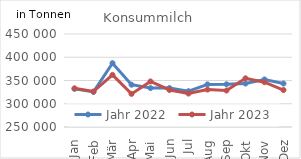
| Category | Jahr 2022 | Jahr 2023 |
|---|---|---|
| Jan | 332001.787 | 333199.953 |
| Feb | 325451.771 | 326309.981 |
| Mär | 387283.406 | 362072.387 |
| Apr | 340948.316 | 321197.593 |
| Mai | 333684.936 | 347976.701 |
| Jun | 333744.565 | 329624.153 |
| Jul | 326940.633 | 321912.043 |
| Aug | 341656.717 | 330492.089 |
| Sep | 341861.306 | 328452.552 |
| Okt | 343428.19 | 354706.428 |
| Nov | 352293.067 | 346410.507 |
| Dez | 343465.638 | 329510.072 |